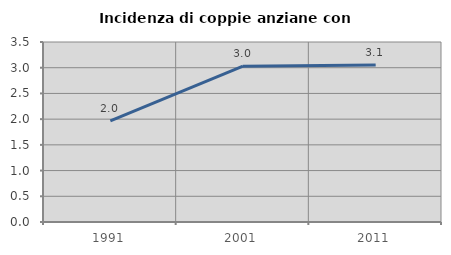
| Category | Incidenza di coppie anziane con figli |
|---|---|
| 1991.0 | 1.969 |
| 2001.0 | 3.03 |
| 2011.0 | 3.051 |